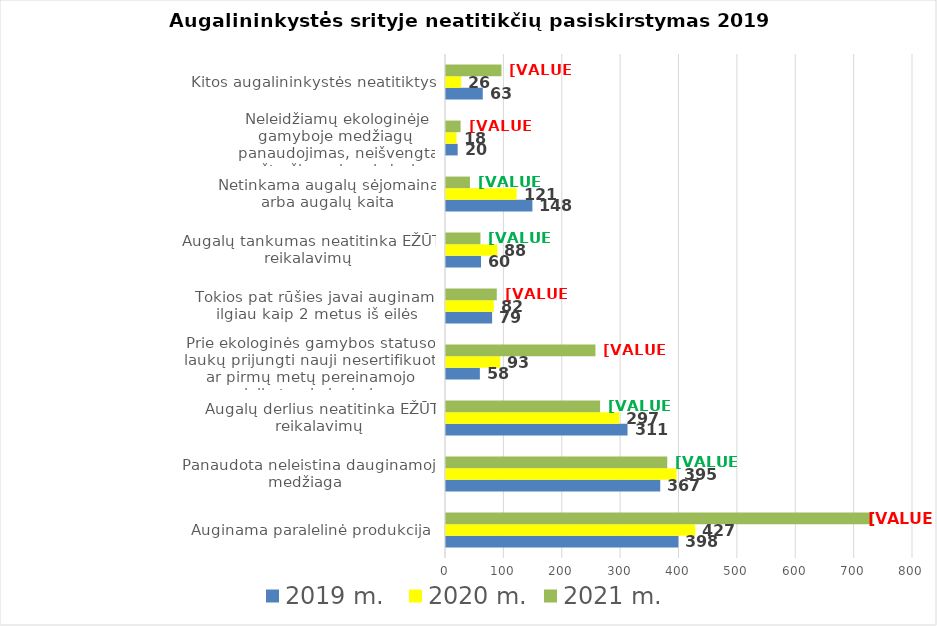
| Category | 2019 m.  | 2020 m. | 2021 m. |
|---|---|---|---|
| Auginama paralelinė produkcija  | 398 | 427 | 731 |
| Panaudota neleistina dauginamoji medžiaga  | 367 | 395 | 379 |
| Augalų derlius neatitinka EŽŪT reikalavimų | 311 | 297 | 264 |
| Prie ekologinės gamybos statuso laukų prijungti nauji nesertifikuoti ar pirmų metų pereinamojo laikotarpio laukai | 58 | 93 | 256 |
| Tokios pat rūšies javai auginami ilgiau kaip 2 metus iš eilės | 79 | 82 | 87 |
| Augalų tankumas neatitinka EŽŪT reikalavimų | 60 | 88 | 59 |
| Netinkama augalų sėjomaina arba augalų kaita | 148 | 121 | 41 |
| Neleidžiamų ekologinėje gamyboje medžiagų  panaudojimas, neišvengta užteršimo cheminėmis medžiagomis | 20 | 18 | 25 |
| Kitos augalininkystės neatitiktys | 63 | 26 | 95 |